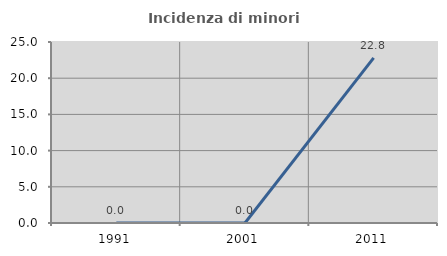
| Category | Incidenza di minori stranieri |
|---|---|
| 1991.0 | 0 |
| 2001.0 | 0 |
| 2011.0 | 22.807 |